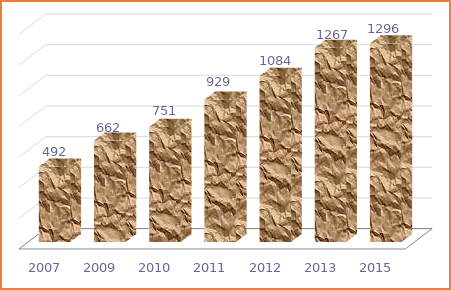
| Category | Series 0 |
|---|---|
| 2007.0 | 492 |
| 2009.0 | 662 |
| 2010.0 | 751 |
| 2011.0 | 929 |
| 2012.0 | 1084 |
| 2013.0 | 1267 |
| 2015.0 | 1296 |